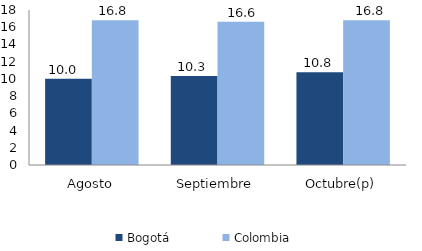
| Category | Bogotá | Colombia |
|---|---|---|
| Agosto | 10.023 | 16.821 |
| Septiembre | 10.325 | 16.643 |
| Octubre(p) | 10.765 | 16.809 |